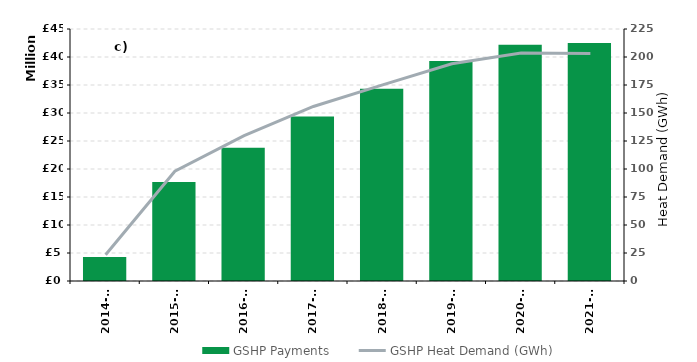
| Category | GSHP Payments |
|---|---|
| 2014-15 | 4278918.45 |
| 2015-16 | 17681220.42 |
| 2016-17 | 23795407.77 |
| 2017-18 | 29387301.96 |
| 2018-19 | 34320265.59 |
| 2019-20 | 39307637.77 |
| 2020-21 | 42203523.14 |
| 2021-22 | 42489568.06 |